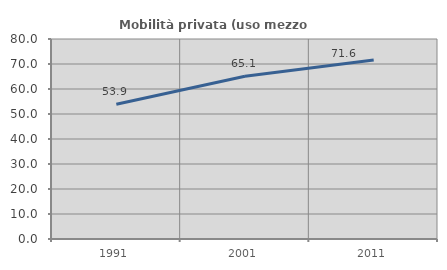
| Category | Mobilità privata (uso mezzo privato) |
|---|---|
| 1991.0 | 53.933 |
| 2001.0 | 65.068 |
| 2011.0 | 71.56 |